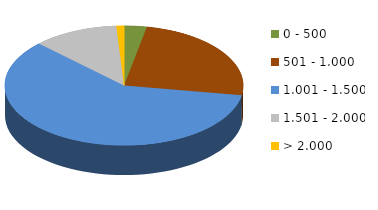
| Category | Series 0 |
|---|---|
| 0 - 500 | 21 |
| 501 - 1.000 | 167 |
| 1.001 - 1.500 | 407 |
| 1.501 - 2.000 | 79 |
| > 2.000 | 7 |